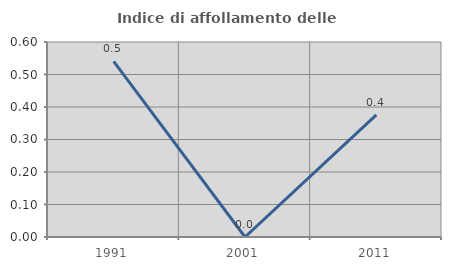
| Category | Indice di affollamento delle abitazioni  |
|---|---|
| 1991.0 | 0.541 |
| 2001.0 | 0 |
| 2011.0 | 0.376 |